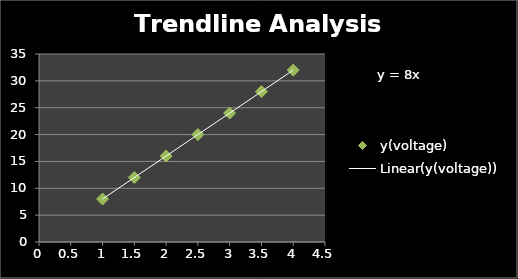
| Category | y(voltage) |
|---|---|
| 1.0 | 8 |
| 1.5 | 12 |
| 2.0 | 16 |
| 2.5 | 20 |
| 3.0 | 24 |
| 3.5 | 28 |
| 4.0 | 32 |